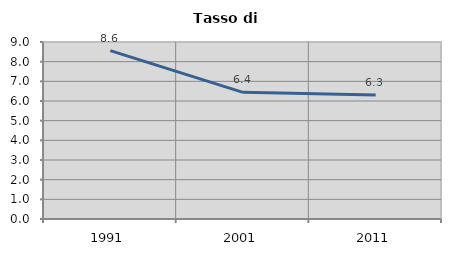
| Category | Tasso di disoccupazione   |
|---|---|
| 1991.0 | 8.563 |
| 2001.0 | 6.442 |
| 2011.0 | 6.301 |